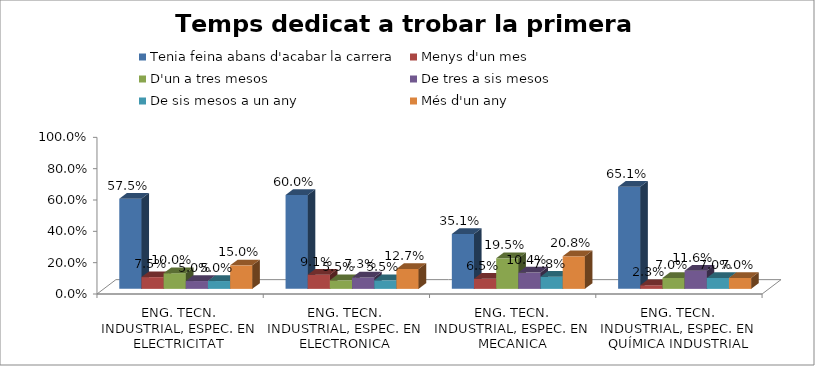
| Category | Tenia feina abans d'acabar la carrera | Menys d'un mes | D'un a tres mesos | De tres a sis mesos | De sis mesos a un any | Més d'un any |
|---|---|---|---|---|---|---|
| ENG. TECN. INDUSTRIAL, ESPEC. EN ELECTRICITAT | 0.575 | 0.075 | 0.1 | 0.05 | 0.05 | 0.15 |
| ENG. TECN. INDUSTRIAL, ESPEC. EN ELECTRONICA INDUSTRIAL | 0.6 | 0.091 | 0.055 | 0.073 | 0.055 | 0.127 |
| ENG. TECN. INDUSTRIAL, ESPEC. EN MECANICA | 0.351 | 0.065 | 0.195 | 0.104 | 0.078 | 0.208 |
| ENG. TECN. INDUSTRIAL, ESPEC. EN QUÍMICA INDUSTRIAL | 0.651 | 0.023 | 0.07 | 0.116 | 0.07 | 0.07 |